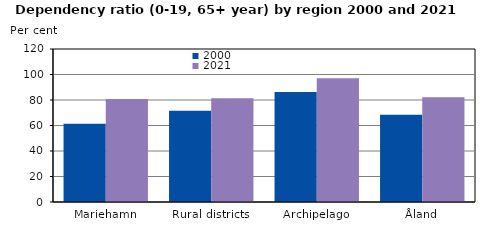
| Category | 2000 | 2021 |
|---|---|---|
| Mariehamn | 61.428 | 80.813 |
| Rural districts | 71.595 | 81.417 |
| Archipelago | 86.201 | 97.028 |
| Åland | 68.482 | 82.159 |